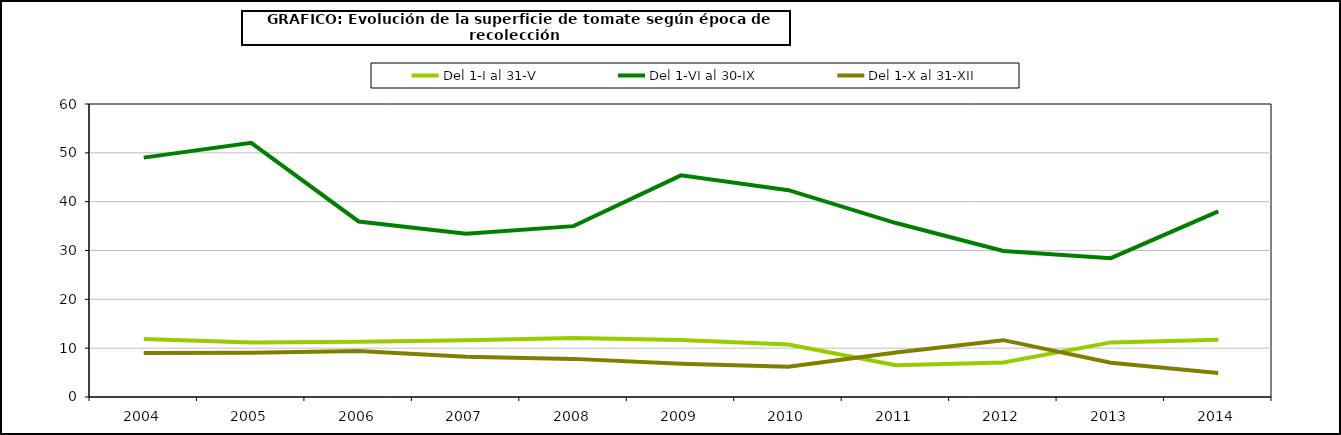
| Category | Del 1-I al 31-V | Del 1-VI al 30-IX | Del 1-X al 31-XII |
|---|---|---|---|
| 2004.0 | 11.867 | 49.018 | 9.017 |
| 2005.0 | 11.149 | 52.049 | 9.087 |
| 2006.0 | 11.312 | 35.942 | 9.436 |
| 2007.0 | 11.626 | 33.45 | 8.221 |
| 2008.0 | 12.07 | 34.991 | 7.807 |
| 2009.0 | 11.671 | 45.383 | 6.784 |
| 2010.0 | 10.742 | 42.349 | 6.176 |
| 2011.0 | 6.491 | 35.62 | 9.093 |
| 2012.0 | 7.086 | 29.889 | 11.641 |
| 2013.0 | 11.18 | 28.439 | 7.005 |
| 2014.0 | 11.722 | 38.024 | 4.929 |